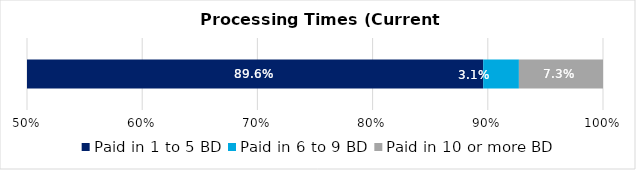
| Category | Paid in 1 to 5 BD | Paid in 6 to 9 BD | Paid in 10 or more BD |
|---|---|---|---|
| 0 | 0.896 | 0.031 | 0.073 |